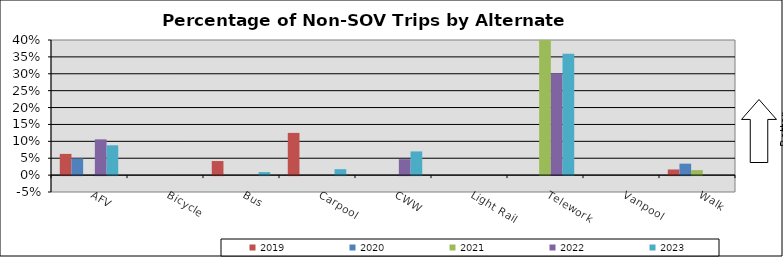
| Category | 2019 | 2020 | 2021 | 2022 | 2023 |
|---|---|---|---|---|---|
| AFV | 0.063 | 0.049 | 0 | 0.106 | 0.088 |
| Bicycle | 0 | 0 | 0 | 0 | 0 |
| Bus | 0.042 | 0 | 0 | 0 | 0.009 |
| Carpool | 0.125 | 0 | 0 | 0 | 0.018 |
| CWW | 0 | 0 | 0 | 0.047 | 0.07 |
| Light Rail | 0 | 0 | 0 | 0 | 0 |
| Telework | 0 | 0 | 0.919 | 0.302 | 0.36 |
| Vanpool | 0 | 0 | 0 | 0 | 0 |
| Walk | 0.017 | 0.034 | 0.015 | 0 | 0 |